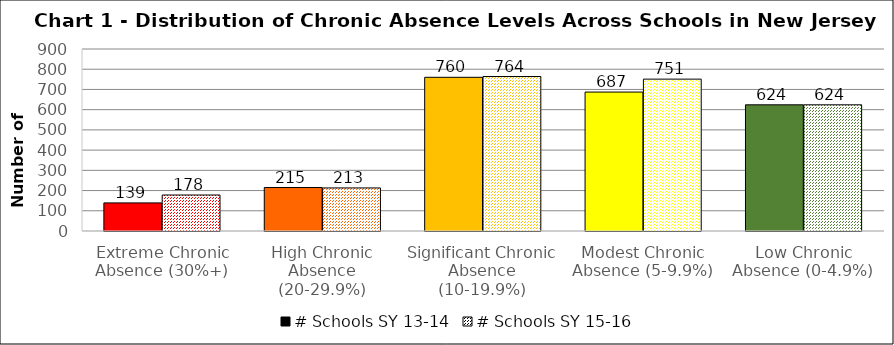
| Category | # Schools SY 13-14 | # Schools SY 15-16 |
|---|---|---|
| Extreme Chronic Absence (30%+) | 139 | 178 |
| High Chronic Absence (20-29.9%) | 215 | 213 |
| Significant Chronic Absence (10-19.9%) | 760 | 764 |
| Modest Chronic Absence (5-9.9%) | 687 | 751 |
| Low Chronic Absence (0-4.9%) | 624 | 624 |